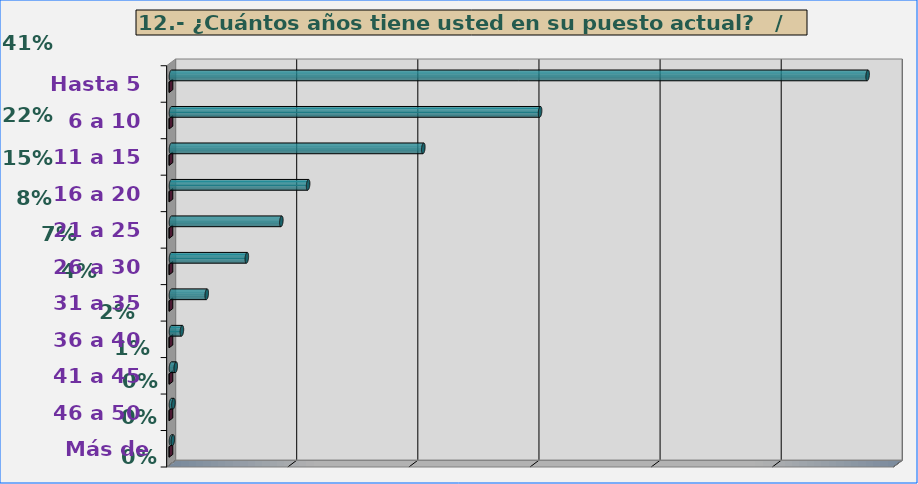
| Category | Series 0 | Series 1 |
|---|---|---|
| Hasta 5 | 5751 | 0.411 |
| 6 a 10 | 3047 | 0.218 |
| 11 a 15 | 2083 | 0.149 |
| 16 a 20 | 1132 | 0.081 |
| 21 a 25 | 911 | 0.065 |
| 26 a 30 | 626 | 0.045 |
| 31 a 35 | 295 | 0.021 |
| 36 a 40 | 90 | 0.006 |
| 41 a 45 | 39 | 0.003 |
| 46 a 50 | 20 | 0.001 |
| Más de 50 | 15 | 0.001 |